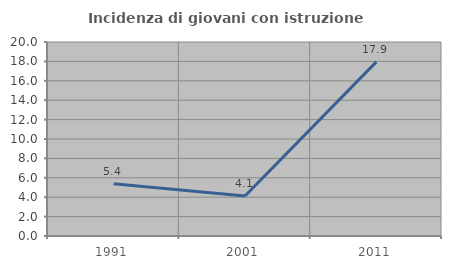
| Category | Incidenza di giovani con istruzione universitaria |
|---|---|
| 1991.0 | 5.376 |
| 2001.0 | 4.124 |
| 2011.0 | 17.949 |